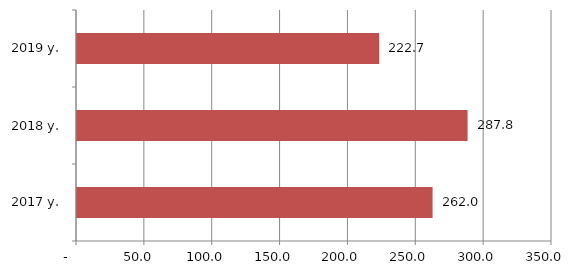
| Category | Series 0 |
|---|---|
| 2017 y. | 262 |
| 2018 y. | 287.8 |
| 2019 y. | 222.7 |